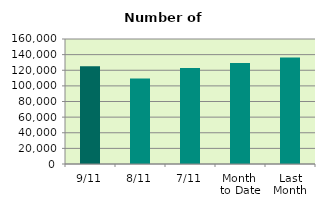
| Category | Series 0 |
|---|---|
| 9/11 | 125140 |
| 8/11 | 109384 |
| 7/11 | 122812 |
| Month 
to Date | 129179.714 |
| Last
Month | 136171.238 |